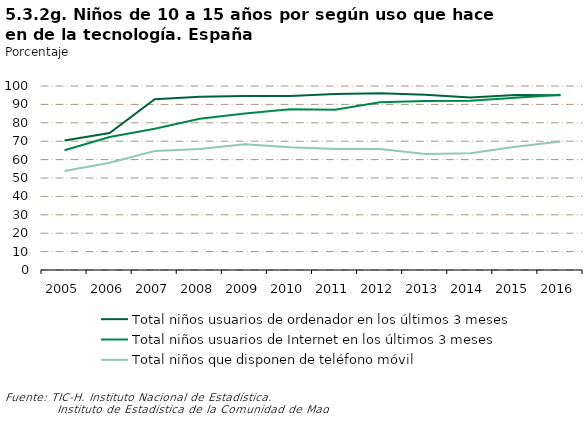
| Category | Total niños usuarios de ordenador en los últimos 3 meses | Total niños usuarios de Internet en los últimos 3 meses | Total niños que disponen de teléfono móvil |
|---|---|---|---|
| 2005.0 | 70.4 | 65.1 | 53.8 |
| 2006.0 | 74.4 | 72.3 | 58.3 |
| 2007.0 | 92.8 | 76.8 | 64.7 |
| 2008.0 | 94.1 | 82.2 | 65.8 |
| 2009.0 | 94.5 | 85.1 | 68.4 |
| 2010.0 | 94.6 | 87.3 | 66.7 |
| 2011.0 | 95.6 | 87.1 | 65.8 |
| 2012.0 | 96.029 | 91.165 | 65.79 |
| 2013.0 | 95.2 | 91.8 | 63 |
| 2014.0 | 93.779 | 91.981 | 63.511 |
| 2015.0 | 95.104 | 93.57 | 67.01 |
| 2016.0 | 94.934 | 95.207 | 69.803 |